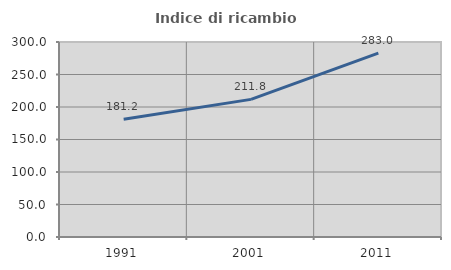
| Category | Indice di ricambio occupazionale  |
|---|---|
| 1991.0 | 181.178 |
| 2001.0 | 211.753 |
| 2011.0 | 282.974 |